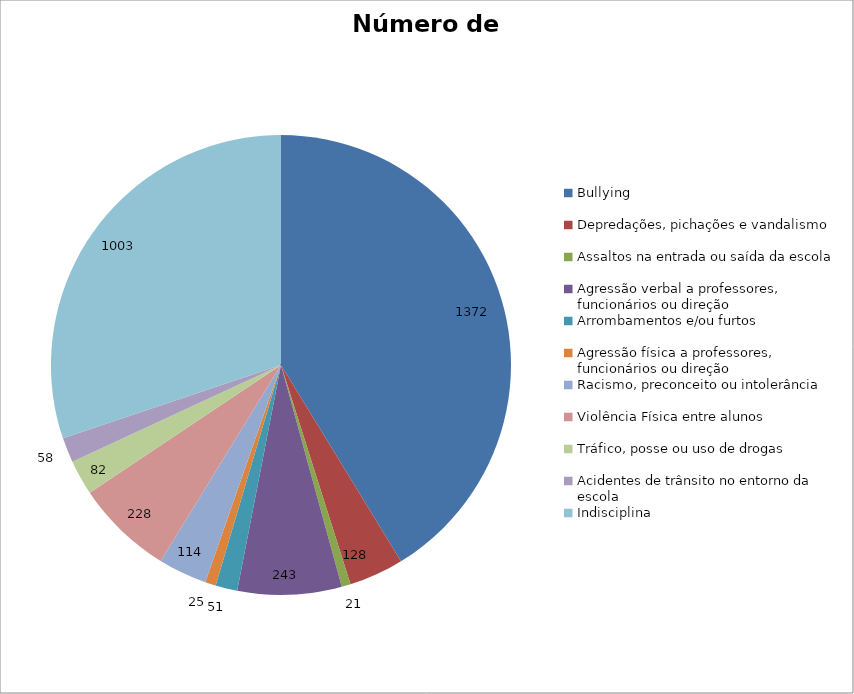
| Category | Número de Casos |
|---|---|
| Bullying | 1372 |
| Depredações, pichações e vandalismo | 128 |
| Assaltos na entrada ou saída da escola | 21 |
| Agressão verbal a professores, funcionários ou direção | 243 |
| Arrombamentos e/ou furtos | 51 |
| Agressão física a professores, funcionários ou direção | 25 |
| Racismo, preconceito ou intolerância | 114 |
| Violência Física entre alunos | 228 |
| Tráfico, posse ou uso de drogas | 82 |
| Acidentes de trânsito no entorno da escola | 58 |
| Indisciplina | 1003 |